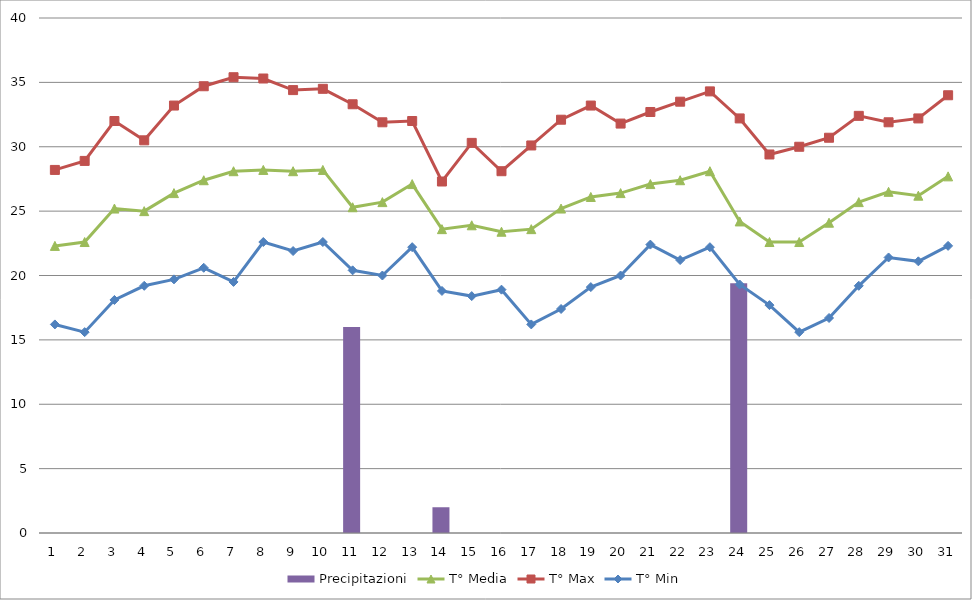
| Category | Precipitazioni |
|---|---|
| 0 | 0 |
| 1 | 0 |
| 2 | 0 |
| 3 | 0 |
| 4 | 0 |
| 5 | 0 |
| 6 | 0 |
| 7 | 0 |
| 8 | 0 |
| 9 | 0 |
| 10 | 16 |
| 11 | 0 |
| 12 | 0 |
| 13 | 2 |
| 14 | 0 |
| 15 | 0 |
| 16 | 0 |
| 17 | 0 |
| 18 | 0 |
| 19 | 0 |
| 20 | 0 |
| 21 | 0 |
| 22 | 0 |
| 23 | 19.4 |
| 24 | 0 |
| 25 | 0 |
| 26 | 0 |
| 27 | 0 |
| 28 | 0 |
| 29 | 0 |
| 30 | 0 |